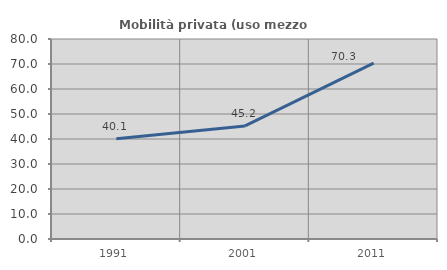
| Category | Mobilità privata (uso mezzo privato) |
|---|---|
| 1991.0 | 40.118 |
| 2001.0 | 45.227 |
| 2011.0 | 70.343 |